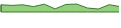
| Category | Series 0 |
|---|---|
| 0 | 60 |
| 1 | 55 |
| 2 | 60 |
| 3 | 45 |
| 4 | 65 |
| 5 | 26 |
| 6 | 63 |
| 7 | 66 |
| 8 | 33 |
| 9 | 25 |
| 10 | 61 |
| 11 | 45 |